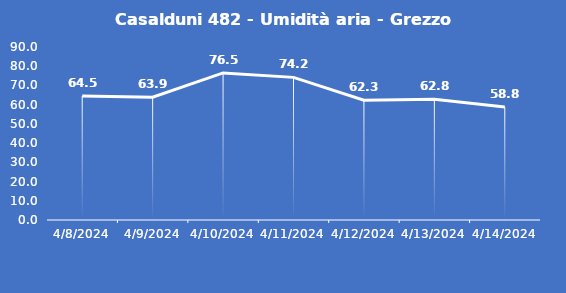
| Category | Casalduni 482 - Umidità aria - Grezzo (%) |
|---|---|
| 4/8/24 | 64.5 |
| 4/9/24 | 63.9 |
| 4/10/24 | 76.5 |
| 4/11/24 | 74.2 |
| 4/12/24 | 62.3 |
| 4/13/24 | 62.8 |
| 4/14/24 | 58.8 |